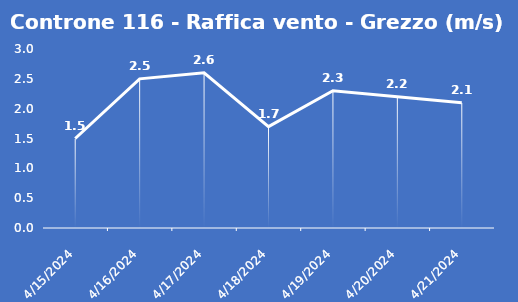
| Category | Controne 116 - Raffica vento - Grezzo (m/s) |
|---|---|
| 4/15/24 | 1.5 |
| 4/16/24 | 2.5 |
| 4/17/24 | 2.6 |
| 4/18/24 | 1.7 |
| 4/19/24 | 2.3 |
| 4/20/24 | 2.2 |
| 4/21/24 | 2.1 |